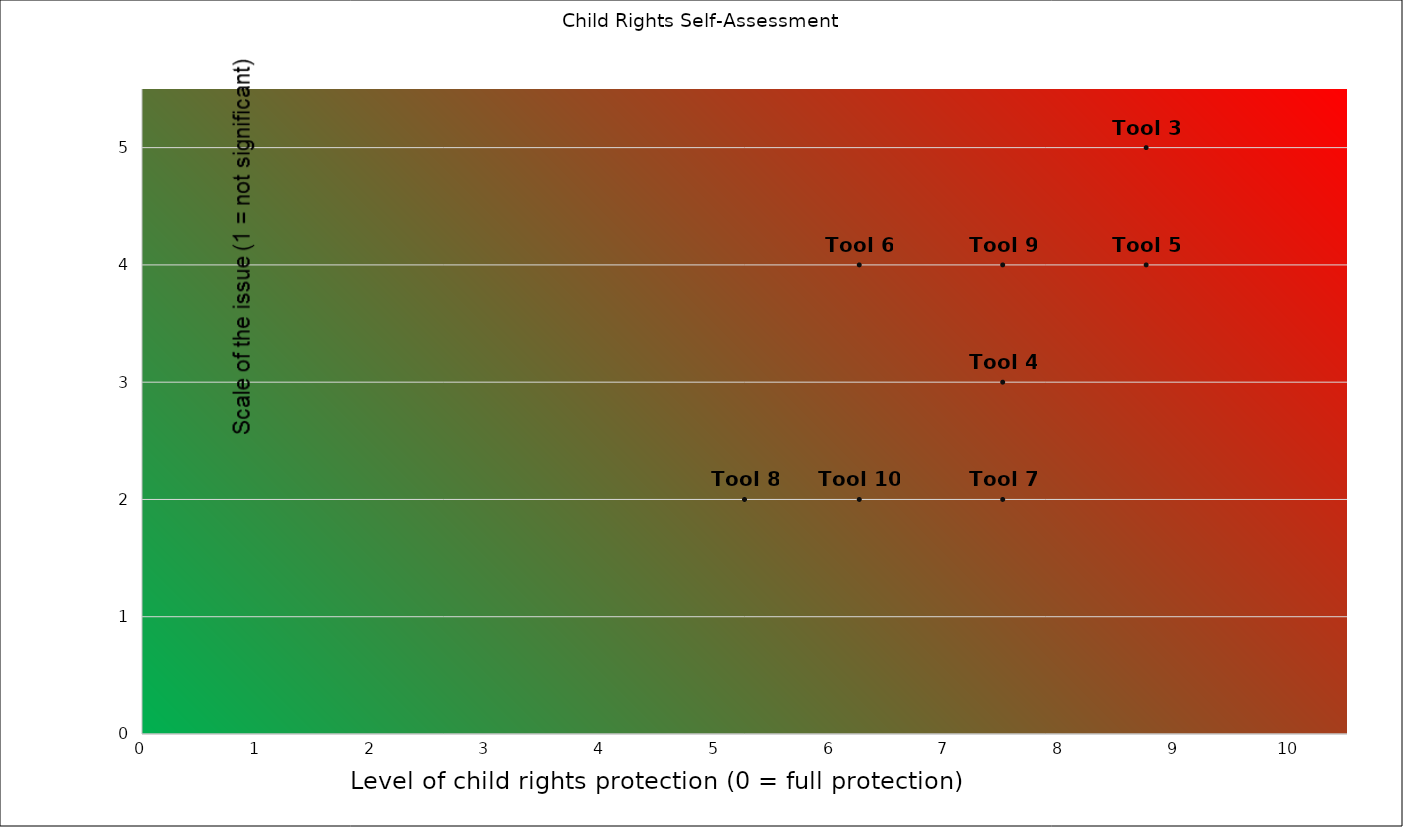
| Category | Tool 3 |
|---|---|
| 8.75 | 5 |
| 7.5 | 3 |
| 8.75 | 4 |
| 6.25 | 4 |
| 7.5 | 2 |
| 5.25 | 2 |
| 7.5 | 4 |
| 6.25 | 2 |